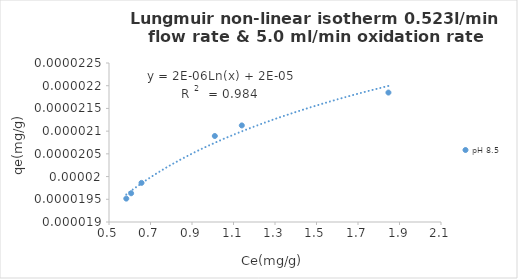
| Category | pH 8.5 |
|---|---|
| 1.8466666666666667 | 0 |
| 1.14 | 0 |
| 1.01 | 0 |
| 0.6566666666666667 | 0 |
| 0.5833333333333334 | 0 |
| 0.6066666666666666 | 0 |